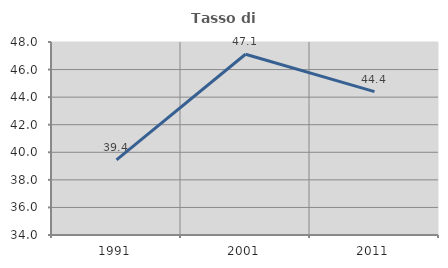
| Category | Tasso di occupazione   |
|---|---|
| 1991.0 | 39.448 |
| 2001.0 | 47.11 |
| 2011.0 | 44.398 |